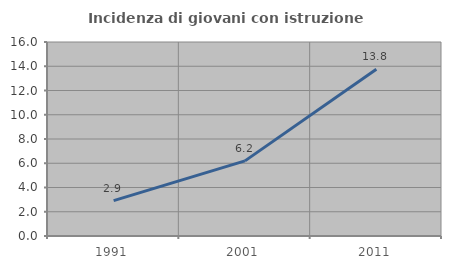
| Category | Incidenza di giovani con istruzione universitaria |
|---|---|
| 1991.0 | 2.913 |
| 2001.0 | 6.195 |
| 2011.0 | 13.75 |